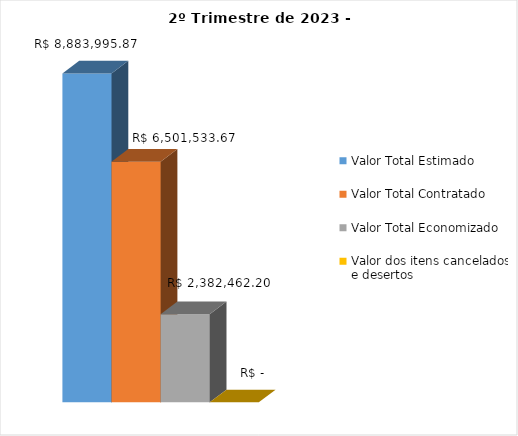
| Category | Valor Total Estimado | Valor Total Contratado | Valor Total Economizado | Valor dos itens cancelados e desertos |
|---|---|---|---|---|
| 0 | 8883995.87 | 6501533.67 | 2382462.2 | 0 |